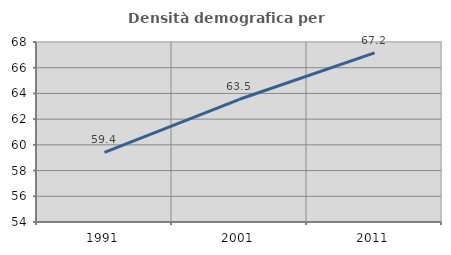
| Category | Densità demografica |
|---|---|
| 1991.0 | 59.42 |
| 2001.0 | 63.544 |
| 2011.0 | 67.157 |